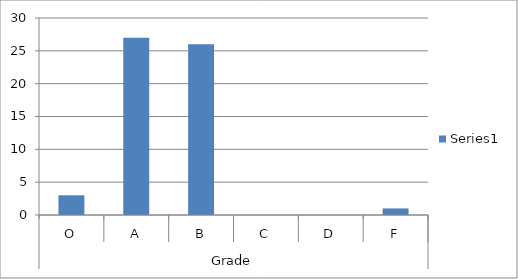
| Category | Series 0 |
|---|---|
| 0 | 3 |
| 1 | 27 |
| 2 | 26 |
| 3 | 0 |
| 4 | 0 |
| 5 | 1 |